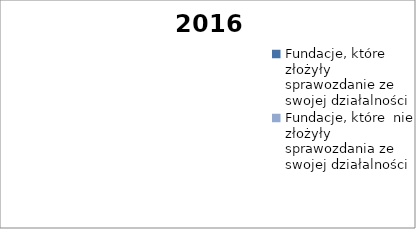
| Category | 2016 |
|---|---|
| Fundacje, które złożyły sprawozdanie ze swojej działalności  | 0 |
| Fundacje, które  nie złożyły sprawozdania ze swojej działalności  | 0 |